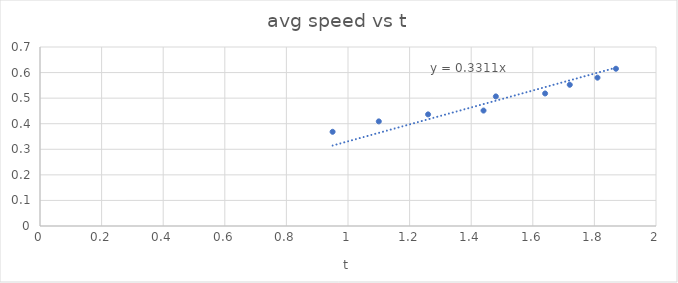
| Category | avg speed |
|---|---|
| 1.87 | 0.615 |
| 1.81 | 0.58 |
| 1.72 | 0.552 |
| 1.64 | 0.518 |
| 1.48 | 0.507 |
| 1.44 | 0.451 |
| 1.26 | 0.437 |
| 1.1 | 0.409 |
| 0.95 | 0.368 |